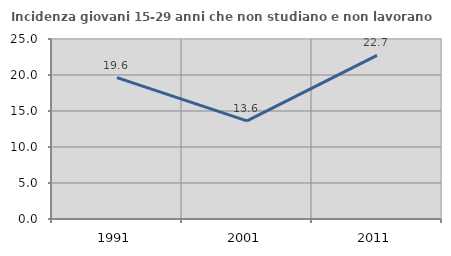
| Category | Incidenza giovani 15-29 anni che non studiano e non lavorano  |
|---|---|
| 1991.0 | 19.643 |
| 2001.0 | 13.636 |
| 2011.0 | 22.727 |